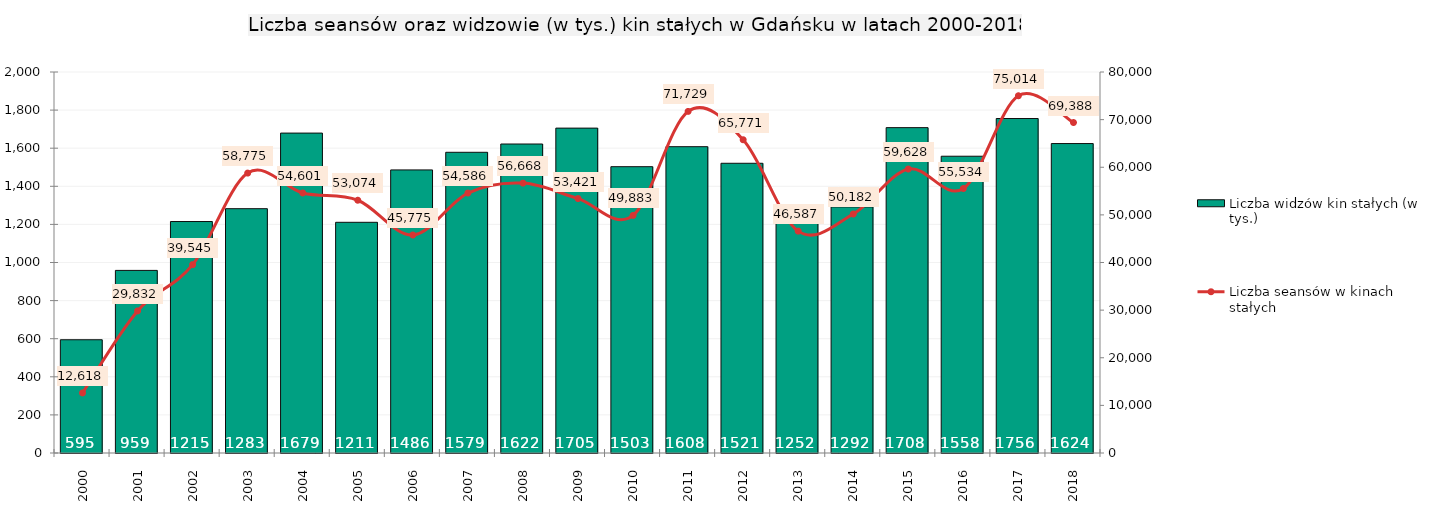
| Category | Liczba widzów kin stałych (w tys.) |
|---|---|
| 2000.0 | 594.5 |
| 2001.0 | 958.5 |
| 2002.0 | 1215.1 |
| 2003.0 | 1282.5 |
| 2004.0 | 1679.3 |
| 2005.0 | 1211 |
| 2006.0 | 1486 |
| 2007.0 | 1578.5 |
| 2008.0 | 1622 |
| 2009.0 | 1705.4 |
| 2010.0 | 1503 |
| 2011.0 | 1608 |
| 2012.0 | 1520.88 |
| 2013.0 | 1252 |
| 2014.0 | 1291.864 |
| 2015.0 | 1708 |
| 2016.0 | 1557.851 |
| 2017.0 | 1755.742 |
| 2018.0 | 1624.345 |